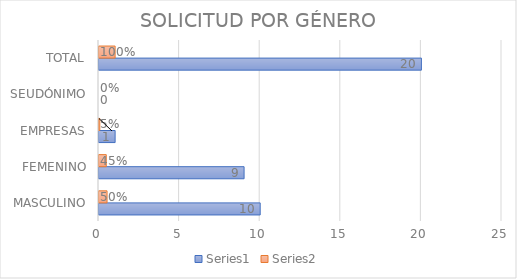
| Category | Series 0 | Series 1 |
|---|---|---|
| MASCULINO | 10 | 0.5 |
| FEMENINO | 9 | 0.45 |
| EMPRESAS | 1 | 0.05 |
| SEUDÓNIMO | 0 | 0 |
| TOTAL | 20 | 1 |